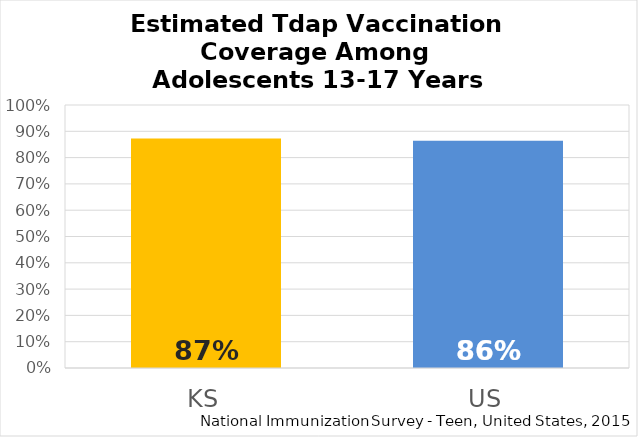
| Category | Tdap |
|---|---|
| KS | 0.873 |
| US | 0.864 |